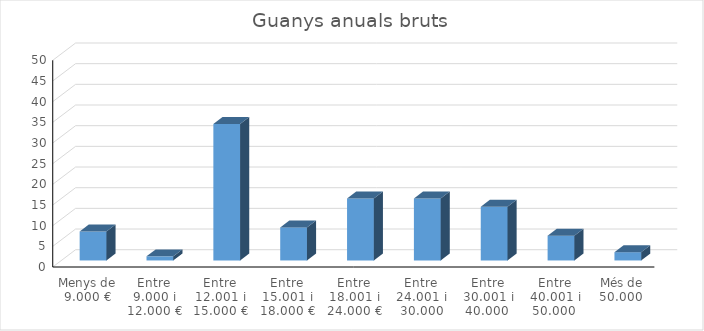
| Category | Series 0 |
|---|---|
| Menys de 9.000 € | 7 |
| Entre 9.000 i 12.000 € | 1 |
| Entre 12.001 i 15.000 € | 33 |
| Entre 15.001 i 18.000 € | 8 |
| Entre 18.001 i 24.000 € | 15 |
| Entre 24.001 i 30.000 | 15 |
| Entre 30.001 i 40.000  | 13 |
| Entre 40.001 i 50.000  | 6 |
| Més de 50.000  | 2 |